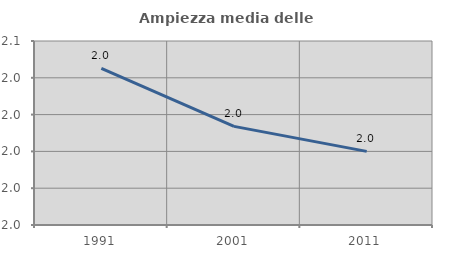
| Category | Ampiezza media delle famiglie |
|---|---|
| 1991.0 | 2.045 |
| 2001.0 | 2.014 |
| 2011.0 | 2 |